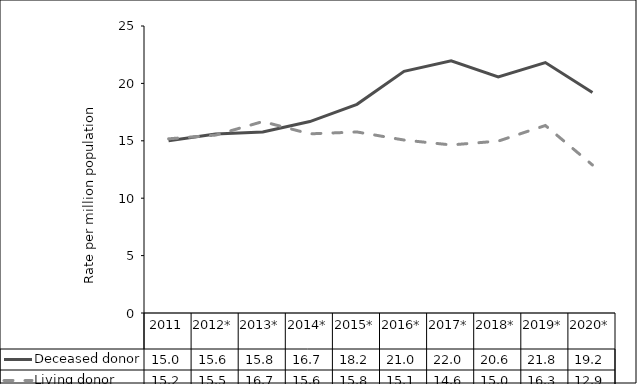
| Category | Deceased donor | Living donor |
|---|---|---|
| 2011 | 14.997 | 15.172 |
| 2012* | 15.584 | 15.498 |
| 2013* | 15.763 | 16.675 |
| 2014* | 16.677 | 15.605 |
| 2015* | 18.178 | 15.769 |
| 2016* | 21.047 | 15.065 |
| 2017* | 21.973 | 14.639 |
| 2018* | 20.558 | 14.974 |
| 2019* | 21.812 | 16.333 |
| 2020* | 19.208 | 12.893 |